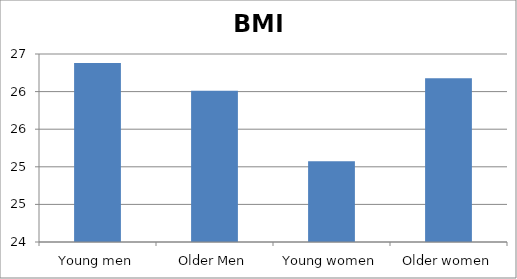
| Category | BMI |
|---|---|
| Young men | 26.38 |
| Older Men | 26.011 |
| Young women | 25.074 |
| Older women | 26.179 |